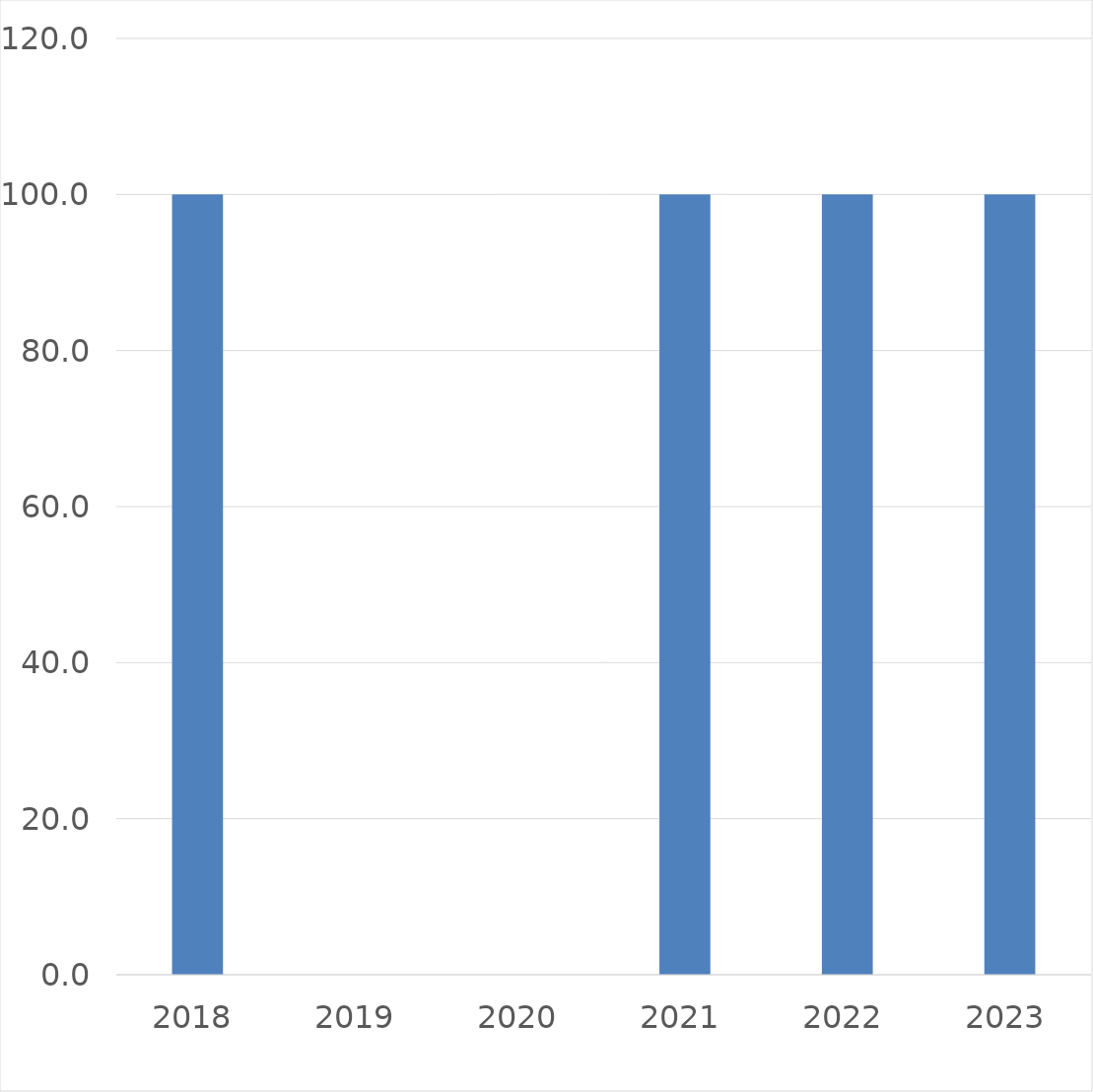
| Category | Series 0 |
|---|---|
| 2018 | 100 |
| 2019 | 0 |
| 2020 | 0 |
| 2021 | 100 |
| 2022 | 100 |
| 2023 | 100 |